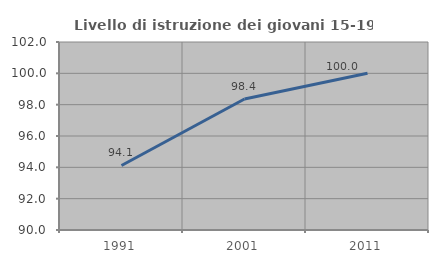
| Category | Livello di istruzione dei giovani 15-19 anni |
|---|---|
| 1991.0 | 94.118 |
| 2001.0 | 98.361 |
| 2011.0 | 100 |